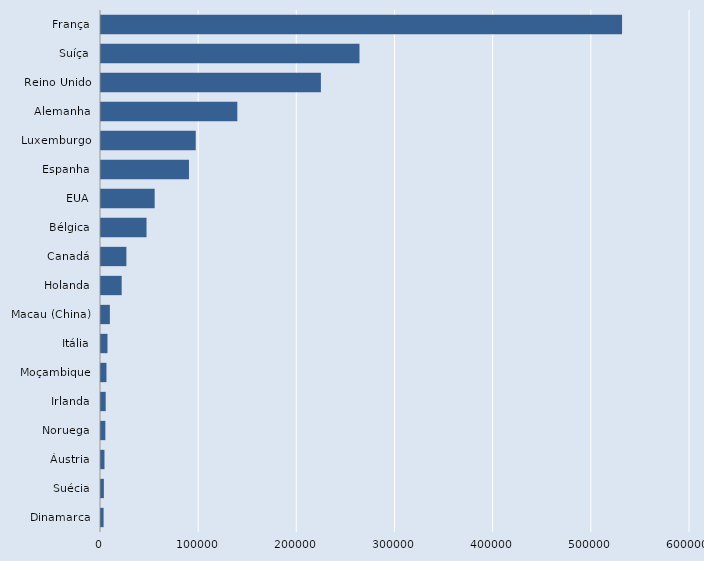
| Category | Series 0 |
|---|---|
| Dinamarca | 2630 |
| Suécia | 2924 |
| Áustria | 3555 |
| Noruega | 4452 |
| Irlanda | 4807 |
| Moçambique | 5560 |
| Itália | 6603 |
| Macau (China) | 9024 |
| Holanda | 21051 |
| Canadá | 25855 |
| Bélgica | 46391 |
| EUA | 54669 |
| Espanha | 89616 |
| Luxemburgo | 96500 |
| Alemanha | 138890 |
| Reino Unido | 224000 |
| Suíça | 263311 |
| França | 530800 |